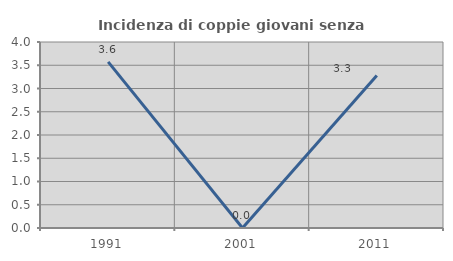
| Category | Incidenza di coppie giovani senza figli |
|---|---|
| 1991.0 | 3.571 |
| 2001.0 | 0 |
| 2011.0 | 3.279 |